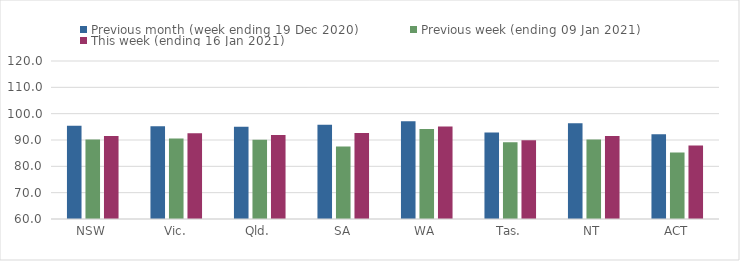
| Category | Previous month (week ending 19 Dec 2020) | Previous week (ending 09 Jan 2021) | This week (ending 16 Jan 2021) |
|---|---|---|---|
| NSW | 95.44 | 90.18 | 91.53 |
| Vic. | 95.21 | 90.53 | 92.52 |
| Qld. | 95.02 | 90.14 | 91.92 |
| SA | 95.76 | 87.49 | 92.63 |
| WA | 97.13 | 94.14 | 95.08 |
| Tas. | 92.85 | 89.12 | 89.93 |
| NT | 96.32 | 90.18 | 91.54 |
| ACT | 92.22 | 85.3 | 87.93 |